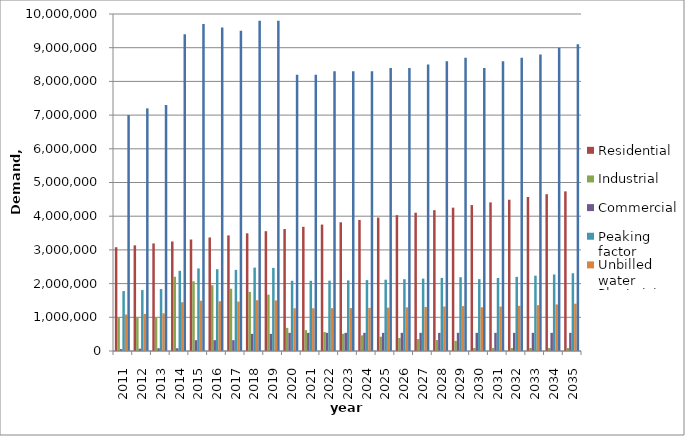
| Category | Residential | Industrial | Commercial | Peaking factor | Unbilled water | Plant sizing |
|---|---|---|---|---|---|---|
| 2011.0 | 3079752.5 | 1001780.822 | 56220 | 1779233.928 | 1082808.667 | 7000000 |
| 2012.0 | 3135496.02 | 1001780.822 | 68720 | 1808578.642 | 1100667.314 | 7200000 |
| 2013.0 | 3192248.498 | 1001780.822 | 81220 | 1838357.208 | 1118789.995 | 7300000 |
| 2014.0 | 3250028.196 | 2201780.822 | 81220 | 2379202.478 | 1447938.364 | 9400000 |
| 2015.0 | 3308853.706 | 2069780.822 | 321220 | 2450937.447 | 1491594.932 | 9700000 |
| 2016.0 | 3368743.958 | 1952300.822 | 321220 | 2426173.856 | 1476524.27 | 9600000 |
| 2017.0 | 3429718.224 | 1847743.622 | 321220 | 2407433.194 | 1465119.052 | 9500000 |
| 2018.0 | 3491796.124 | 1754687.714 | 508720 | 2474737.65 | 1506079.292 | 9800000 |
| 2019.0 | 3554997.634 | 1671867.956 | 508720 | 2466301.804 | 1500945.393 | 9800000 |
| 2020.0 | 3619343.091 | 686377.549 | 538720 | 2083109.475 | 1267741.671 | 8200000 |
| 2021.0 | 3684853.201 | 620776.019 | 538720 | 2083070.164 | 1267717.747 | 8200000 |
| 2022.0 | 3751549.044 | 562390.657 | 538720 | 2086643.671 | 1269892.517 | 8300000 |
| 2023.0 | 3819452.082 | 510427.684 | 538720 | 2093497.899 | 1274063.873 | 8300000 |
| 2024.0 | 3888584.164 | 464180.639 | 538720 | 2103338.465 | 1280052.658 | 8300000 |
| 2025.0 | 3958967.538 | 423020.769 | 538720 | 2115904.572 | 1287700.157 | 8400000 |
| 2026.0 | 4030624.85 | 386388.484 | 538720 | 2130965.334 | 1296865.856 | 8400000 |
| 2027.0 | 4103579.16 | 353785.751 | 538720 | 2148316.512 | 1307425.46 | 8500000 |
| 2028.0 | 4177853.943 | 324769.318 | 538720 | 2167777.602 | 1319269.118 | 8600000 |
| 2029.0 | 4253473.099 | 298944.693 | 538720 | 2189189.251 | 1332299.849 | 8700000 |
| 2030.0 | 4330460.962 | 90000 | 538720 | 2132447.814 | 1297768.066 | 8400000 |
| 2031.0 | 4408842.305 | 90000 | 538720 | 2166151.791 | 1318279.68 | 8600000 |
| 2032.0 | 4488642.351 | 90000 | 538720 | 2200465.811 | 1339162.554 | 8700000 |
| 2033.0 | 4569886.778 | 90000 | 538720 | 2235400.914 | 1360423.408 | 8800000 |
| 2034.0 | 4652601.728 | 90000 | 538720 | 2270968.343 | 1382069.083 | 9000000 |
| 2035.0 | 4736813.82 | 90000 | 538720 | 2307179.542 | 1404106.545 | 9100000 |